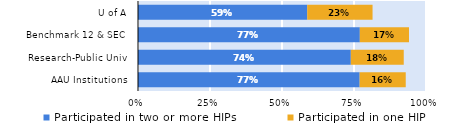
| Category | Participated in two or more HIPs | Participated in one HIP |
|---|---|---|
| AAU Institutions | 0.77 | 0.16 |
| Research-Public Univ | 0.739 | 0.184 |
| Benchmark 12 & SEC | 0.77 | 0.171 |
| U of A | 0.588 | 0.227 |